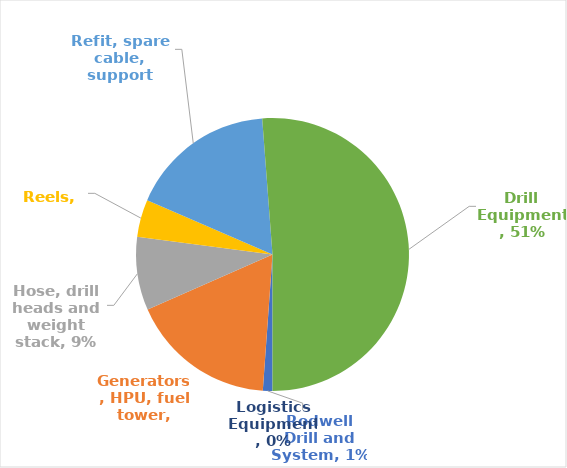
| Category | Series 0 |
|---|---|
| Rodwell Drill and System | 6600 |
| Generators, HPU, fuel tower | 100341 |
| Hose, drill heads and weight stack | 50571 |
| Reels | 25600 |
| Refit, spare cable, support equip. | 100628 |
| Drill Equipment | 297708 |
| Logistics Equipment | 10 |